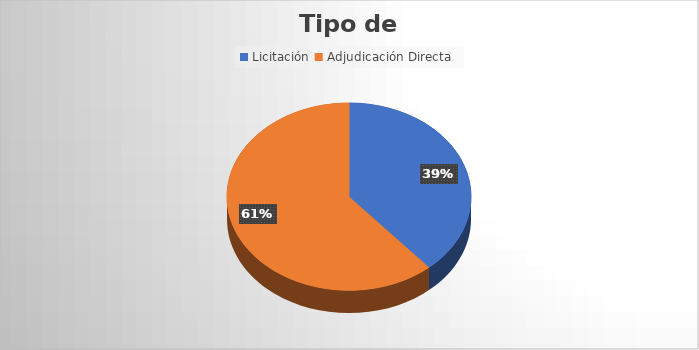
| Category | Monto |
|---|---|
| Licitación  | 9612556.88 |
| Adjudicación Directa  | 15274537.164 |